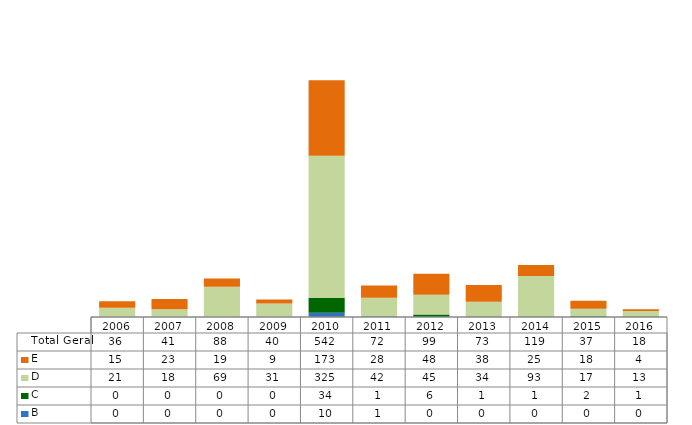
| Category | B | C | D | E | Total Geral |
|---|---|---|---|---|---|
| 2006.0 | 0 | 0 | 21 | 15 | 36 |
| 2007.0 | 0 | 0 | 18 | 23 | 41 |
| 2008.0 | 0 | 0 | 69 | 19 | 88 |
| 2009.0 | 0 | 0 | 31 | 9 | 40 |
| 2010.0 | 10 | 34 | 325 | 173 | 542 |
| 2011.0 | 1 | 1 | 42 | 28 | 72 |
| 2012.0 | 0 | 6 | 45 | 48 | 99 |
| 2013.0 | 0 | 1 | 34 | 38 | 73 |
| 2014.0 | 0 | 1 | 93 | 25 | 119 |
| 2015.0 | 0 | 2 | 17 | 18 | 37 |
| 2016.0 | 0 | 1 | 13 | 4 | 18 |